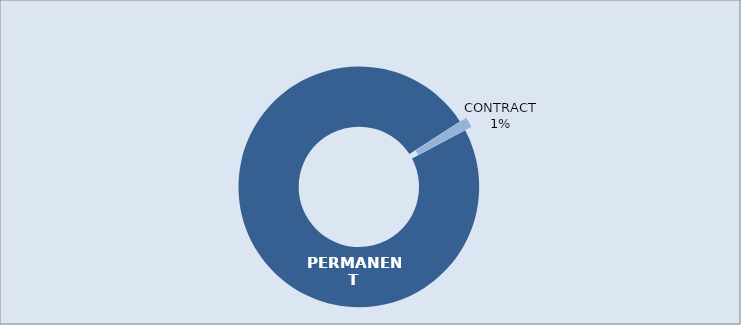
| Category | Series 0 |
|---|---|
| PERMANENT | 98.632 |
| CONTRACT | 1.368 |